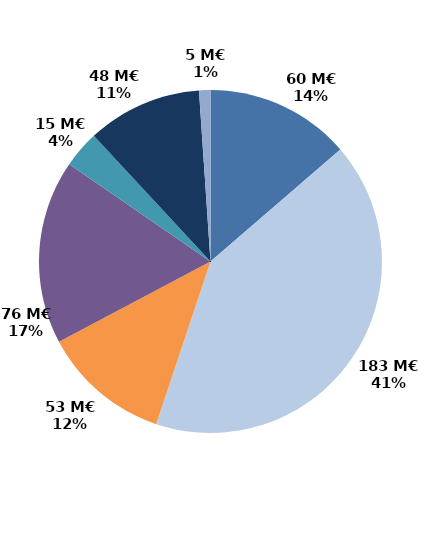
| Category | Series 0 |
|---|---|
| Accueil et information (CEP 1) | 60.164 |
| Accompagnement renforcé (CEP 2 et 3) | 182.517 |
| Suivi | 53.276 |
| Missions locales | 76.408 |
| CSP | 15.368 |
| Aide à la création d'entreprise | 47.697 |
| Aide à l'insertion | 4.72 |